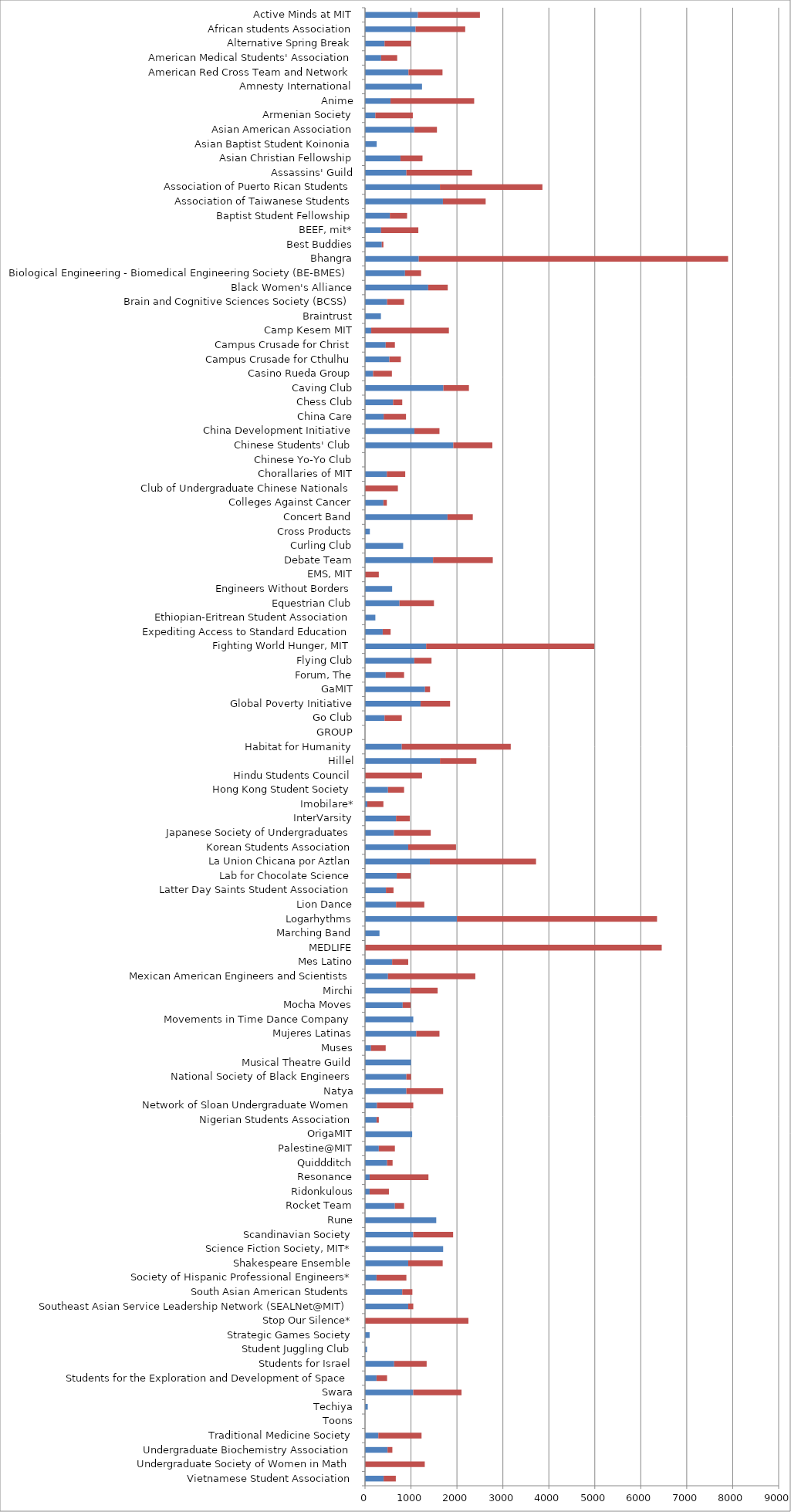
| Category | 500 | 0 |
|---|---|---|
| Vietnamese Student Association | 405 | 265 |
| Undergraduate Society of Women in Math | 0 | 1300 |
| Undergraduate Biochemistry Association | 490 | 105 |
| Traditional Medicine Society | 290 | 940 |
| Toons | 0 | 0 |
| Techiya | 60 | 0 |
| Swara | 1050 | 1050 |
| Students for the Exploration and Development of Space | 250 | 230 |
| Students for Israel | 634 | 707 |
| Student Juggling Club | 45 | 0 |
| Strategic Games Society | 100 | 0 |
| Stop Our Silence* | 0 | 2250 |
| Southeast Asian Service Leadership Network (SEALNet@MIT) | 940 | 110 |
| South Asian American Students | 810 | 220 |
| Society of Hispanic Professional Engineers* | 250 | 650 |
| Shakespeare Ensemble | 940 | 750 |
| Science Fiction Society, MIT* | 1700 | 0 |
| Scandinavian Society | 1050 | 867 |
| Rune | 1550 | 0 |
| Rocket Team | 650 | 200 |
| Ridonkulous | 100 | 420 |
| Resonance | 100 | 1280 |
| Quiddditch | 480 | 120 |
| Palestine@MIT | 300 | 350 |
| OrigaMIT | 1026 | 0 |
| Nigerian Students Association | 250 | 50 |
| Network of Sloan Undergraduate Women | 260 | 790 |
| Natya | 900 | 800 |
| National Society of Black Engineers | 900 | 100 |
| Musical Theatre Guild | 1000 | 0 |
| Muses | 130 | 320 |
| Mujeres Latinas | 1115 | 505 |
| Movements in Time Dance Company | 1050 | 0 |
| Mocha Moves | 820 | 170 |
| Mirchi | 980 | 600 |
| Mexican American Engineers and Scientists | 500 | 1900 |
| Mes Latino | 590 | 350 |
| MEDLIFE | 0 | 6456 |
| Marching Band | 315 | 0 |
| Logarhythms | 2000 | 4354 |
| Lion Dance | 675 | 615 |
| Latter Day Saints Student Association | 455 | 165 |
| Lab for Chocolate Science | 690 | 300 |
| La Union Chicana por Aztlan | 1410 | 2311 |
| Korean Students Association | 940 | 1040 |
| Japanese Society of Undergraduates | 630 | 800 |
| InterVarsity | 675 | 300 |
| Imobilare* | 50 | 350 |
| Hong Kong Student Society | 500 | 350 |
| Hindu Students Council | 0 | 1240 |
| Hillel | 1631 | 792 |
| Habitat for Humanity | 800 | 2371 |
| GROUP | 0 | 0 |
| Go Club | 425 | 375 |
| Global Poverty Initiative | 1210 | 641 |
| GaMIT | 1305 | 110 |
| Forum, The | 450 | 400 |
| Flying Club | 1072 | 375 |
| Fighting World Hunger, MIT | 1330 | 3660 |
| Expediting Access to Standard Education | 385 | 172 |
| Ethiopian-Eritrean Student Association | 225 | 0 |
| Equestrian Club | 750 | 750 |
| Engineers Without Borders | 590 | 0 |
| EMS, MIT | 0 | 300 |
| Debate Team | 1480 | 1300 |
| Curling Club | 830 | 0 |
| Cross Products | 105 | 0 |
| Concert Band | 1795 | 550 |
| Colleges Against Cancer | 400 | 75 |
| Club of Undergraduate Chinese Nationals | 0 | 715 |
| Chorallaries of MIT | 475 | 400 |
| Chinese Yo-Yo Club | 0 | 0 |
| Chinese Students' Club | 1921 | 850 |
| China Development Initiative | 1075 | 545 |
| China Care | 405 | 487 |
| Chess Club | 610 | 200 |
| Caving Club | 1705 | 556 |
| Casino Rueda Group | 175 | 410 |
| Campus Crusade for Cthulhu | 530 | 250 |
| Campus Crusade for Christ | 450 | 200 |
| Camp Kesem MIT | 135 | 1690 |
| Braintrust | 346 | 0 |
| Brain and Cognitive Sciences Society (BCSS) | 480 | 370 |
| Black Women's Alliance | 1375 | 425 |
| Biological Engineering - Biomedical Engineering Society (BE-BMES) | 870 | 350 |
| Bhangra | 1170 | 6730 |
| Best Buddies | 365 | 35 |
| BEEF, mit* | 350 | 810 |
| Baptist Student Fellowship | 540 | 375 |
| Association of Taiwanese Students | 1695 | 930 |
| Association of Puerto Rican Students | 1630 | 2230 |
| Assassins' Guild | 900 | 1430 |
| Asian Christian Fellowship | 771 | 480 |
| Asian Baptist Student Koinonia | 254 | 0 |
| Asian American Association | 1070 | 495 |
| Armenian Society | 225 | 815 |
| Anime | 555 | 1820 |
| Amnesty International | 1240 | 0 |
| American Red Cross Team and Network | 946 | 740 |
| American Medical Students' Association | 350 | 350 |
| Alternative Spring Break | 425 | 575 |
| African students Association | 1100 | 1080 |
| Active Minds at MIT | 1150 | 1350 |